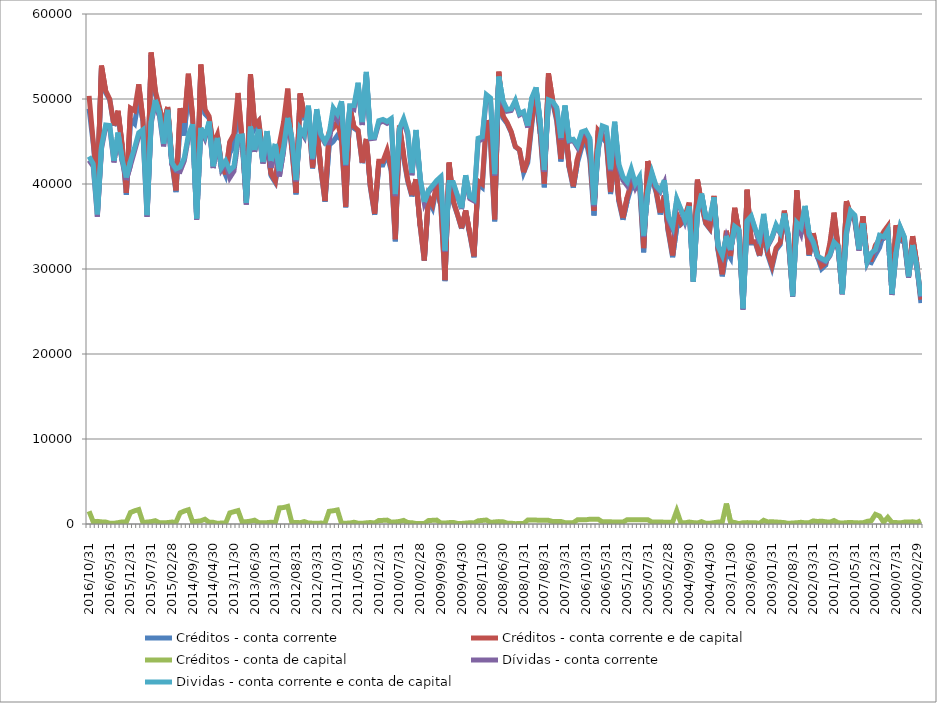
| Category | Créditos - conta corrente | Créditos - conta corrente e de capital | Créditos - conta de capital | Dívidas - conta corrente | Dividas - conta corrente e conta de capital |
|---|---|---|---|---|---|
| 2016/10/31 | 48865.324 | 50365.243 | 1499.919 | 42779.808 | 43222.333 |
| 2016/09/30 | 44779.5 | 45046.171 | 266.672 | 42072.833 | 42371.648 |
| 2016/08/31 | 39434.341 | 39742.585 | 308.244 | 36152.627 | 36422.026 |
| 2016/07/31 | 53685.147 | 53936.374 | 251.227 | 44141.913 | 44397.825 |
| 2016/06/30 | 50749.589 | 50980.381 | 230.791 | 46668.198 | 46935.631 |
| 2016/05/31 | 49876.997 | 49969.669 | 92.672 | 46650.019 | 46871.254 |
| 2016/04/30 | 46828.657 | 46913.542 | 84.885 | 42537.437 | 42752.591 |
| 2016/03/31 | 48455.402 | 48614.018 | 158.616 | 45665.224 | 46042.35 |
| 2016/02/29 | 44269.989 | 44514.844 | 244.855 | 42673.574 | 42911.811 |
| 2016/01/31 | 38735.212 | 38961.596 | 226.384 | 40464.613 | 40768.068 |
| 2015/12/31 | 47582.451 | 48935.823 | 1353.372 | 42168.585 | 42690.55 |
| 2015/11/30 | 47085.097 | 48635.657 | 1550.56 | 43868.27 | 44259.005 |
| 2015/10/31 | 50029.694 | 51730.105 | 1700.411 | 45622.916 | 46020.677 |
| 2015/09/30 | 47494.231 | 47688.633 | 194.401 | 46130.667 | 46377.412 |
| 2015/08/31 | 37550.584 | 37776.321 | 225.736 | 36134.857 | 36338.492 |
| 2015/07/31 | 55192.791 | 55473.969 | 281.178 | 47129.334 | 47392.89 |
| 2015/06/30 | 50593.165 | 50982.056 | 388.891 | 49495.722 | 49883.516 |
| 2015/05/31 | 48882.201 | 49027.224 | 145.023 | 48025.627 | 48344.621 |
| 2015/04/30 | 46868.05 | 47002.537 | 134.488 | 44432.512 | 44742.882 |
| 2015/03/31 | 48893.271 | 49061.355 | 168.085 | 48298.176 | 48720.742 |
| 2015/02/28 | 42580.079 | 42807.416 | 227.337 | 42283.067 | 42533.148 |
| 2015/01/31 | 39049.224 | 39250.112 | 200.888 | 41561.184 | 41779.132 |
| 2014/12/31 | 47598.408 | 48907.463 | 1309.056 | 41467.886 | 41992.816 |
| 2014/11/30 | 45698.678 | 47218.859 | 1520.181 | 42716.403 | 43068.904 |
| 2014/10/31 | 51289.788 | 52965.5 | 1675.712 | 45413.674 | 45772.513 |
| 2014/09/30 | 47801.002 | 48058.895 | 257.893 | 46848.709 | 47035.557 |
| 2014/08/31 | 37288.677 | 37598.434 | 309.757 | 35813.914 | 35966.246 |
| 2014/07/31 | 53677.774 | 54052.556 | 374.782 | 46410.29 | 46590.428 |
| 2014/06/30 | 48237.107 | 48796.333 | 559.226 | 45357.3 | 45618.903 |
| 2014/05/31 | 47750.104 | 47959.809 | 209.705 | 47130.866 | 47344.483 |
| 2014/04/30 | 44440.039 | 44634.246 | 194.207 | 41876.816 | 42083.543 |
| 2014/03/31 | 45718.631 | 45802.101 | 83.47 | 44998.532 | 45416.668 |
| 2014/02/28 | 42192.799 | 42305.034 | 112.234 | 41705.637 | 41951.932 |
| 2014/01/31 | 41041.676 | 41138.525 | 96.849 | 42498.017 | 42712.708 |
| 2013/12/31 | 43663.341 | 44967.303 | 1303.961 | 40742.037 | 41610.384 |
| 2013/11/30 | 44427.846 | 45873.119 | 1445.273 | 41506.413 | 42077.54 |
| 2013/10/31 | 49134.919 | 50712.839 | 1577.92 | 45003.42 | 45590.482 |
| 2013/09/30 | 44894.642 | 45125.674 | 231.032 | 45381.384 | 45656.483 |
| 2013/08/31 | 37713.968 | 37985.905 | 271.938 | 37562.827 | 37789.121 |
| 2013/07/31 | 52570.013 | 52903.759 | 333.746 | 46488.663 | 46750.494 |
| 2013/06/30 | 46489.944 | 46937.577 | 447.633 | 43788.922 | 44007.846 |
| 2013/05/31 | 47283.995 | 47441.362 | 157.368 | 46282.401 | 46459.027 |
| 2013/04/30 | 43411.575 | 43559.545 | 147.97 | 42415.729 | 42585.29 |
| 2013/03/31 | 44620.447 | 44781.299 | 160.852 | 44816.402 | 46216.97 |
| 2013/02/28 | 40966.018 | 41175.761 | 209.743 | 41916.541 | 42713.792 |
| 2013/01/31 | 40176.188 | 40334.085 | 157.897 | 43998.849 | 44710.725 |
| 2012/12/31 | 42817.345 | 44715.946 | 1898.601 | 40889.678 | 41533.029 |
| 2012/11/30 | 45333.276 | 47268.401 | 1935.124 | 43902.328 | 44335.808 |
| 2012/10/31 | 49149.909 | 51221.476 | 2071.566 | 47334.229 | 47773.125 |
| 2012/09/30 | 44021.937 | 44192.649 | 170.712 | 45202.851 | 45388.513 |
| 2012/08/31 | 38777.041 | 38964.997 | 187.956 | 40314.062 | 40461.688 |
| 2012/07/31 | 50503.224 | 50657.508 | 154.283 | 46342.998 | 46507.596 |
| 2012/06/30 | 47819.239 | 48104.133 | 284.894 | 45550.163 | 45776.288 |
| 2012/05/31 | 48032.994 | 48143.264 | 110.27 | 49039.161 | 49220.692 |
| 2012/04/30 | 41833.358 | 41934.742 | 101.384 | 42847.488 | 43020.197 |
| 2012/03/31 | 46686.481 | 46770.052 | 83.57 | 48506.022 | 48808 |
| 2012/02/29 | 41717.915 | 41826.51 | 108.595 | 45689.735 | 45867.625 |
| 2012/01/31 | 37913.349 | 37998.492 | 85.143 | 44809.387 | 44968.71 |
| 2011/12/31 | 44590.129 | 46083.83 | 1493.701 | 44852.337 | 45903.698 |
| 2011/11/30 | 45004.77 | 46561.74 | 1556.97 | 48259.005 | 48947.917 |
| 2011/10/31 | 45700.279 | 47354.417 | 1654.138 | 47527.197 | 48232.286 |
| 2011/09/30 | 45175.007 | 45252.777 | 77.77 | 49529.768 | 49748.628 |
| 2011/08/31 | 37250.593 | 37345.99 | 95.397 | 42125.47 | 42307.308 |
| 2011/07/31 | 48927.305 | 49039.976 | 112.672 | 49016.807 | 49220.827 |
| 2011/06/30 | 46558.073 | 46767.076 | 209.003 | 48789.673 | 49240.05 |
| 2011/05/31 | 46233.51 | 46324.369 | 90.859 | 51560.714 | 51915.641 |
| 2011/04/30 | 42452.263 | 42533.743 | 81.481 | 46950.063 | 47284.195 |
| 2011/03/31 | 45164.581 | 45304.417 | 139.836 | 52912.939 | 53184.11 |
| 2011/02/28 | 39480.706 | 39656.781 | 176.076 | 45319.193 | 45484.118 |
| 2011/01/31 | 36382.839 | 36495.232 | 112.393 | 45378.393 | 45521.048 |
| 2010/12/31 | 42268.005 | 42680.571 | 412.566 | 47151.289 | 47444.972 |
| 2010/11/30 | 42242.776 | 42669.084 | 426.308 | 47401.449 | 47602 |
| 2010/10/31 | 43518.307 | 43974.708 | 456.401 | 47141.62 | 47343.472 |
| 2010/09/30 | 41546.292 | 41757.545 | 211.253 | 47401.799 | 47680.958 |
| 2010/08/31 | 33259.686 | 33503.322 | 243.636 | 38582.987 | 38820.814 |
| 2010/07/31 | 46563.524 | 46859.982 | 296.457 | 46272.704 | 46554.239 |
| 2010/06/30 | 43044.955 | 43467.503 | 422.548 | 47332.352 | 47683.783 |
| 2010/05/31 | 40320.38 | 40487.827 | 167.447 | 45827.206 | 46109.295 |
| 2010/04/30 | 38540.234 | 38693.411 | 153.177 | 41019.852 | 41289.234 |
| 2010/03/31 | 40493.285 | 40545.539 | 52.254 | 46122.28 | 46363.125 |
| 2010/02/28 | 35025.989 | 35094.201 | 68.212 | 40592.449 | 40740.598 |
| 2010/01/31 | 30966.787 | 31015.871 | 49.084 | 37759.23 | 37886.515 |
| 2009/12/31 | 38157.869 | 38559.493 | 401.624 | 38983.311 | 39220.399 |
| 2009/11/30 | 37175.876 | 37607.532 | 431.655 | 39645.531 | 39804.06 |
| 2009/10/31 | 39609.192 | 40067.575 | 458.383 | 40243.771 | 40402.308 |
| 2009/09/30 | 37442.278 | 37552.341 | 110.062 | 40681.426 | 40852.609 |
| 2009/08/31 | 28572.592 | 28685.792 | 113.2 | 32033.87 | 32178.679 |
| 2009/07/31 | 42363.113 | 42525.939 | 162.826 | 39993.303 | 40169.506 |
| 2009/06/30 | 37838.124 | 38023.893 | 185.769 | 40026.803 | 40176.509 |
| 2009/05/31 | 36396.93 | 36466.817 | 69.886 | 38555.81 | 38675.565 |
| 2009/04/30 | 34748.541 | 34813.308 | 64.768 | 37049.639 | 37163.028 |
| 2009/03/31 | 36794.437 | 36899.79 | 105.353 | 40702.64 | 41027.714 |
| 2009/02/28 | 34022.706 | 34168.015 | 145.309 | 38281.039 | 38502.902 |
| 2009/01/31 | 31373.656 | 31499.555 | 125.899 | 38010.367 | 38191.748 |
| 2008/12/31 | 39991.148 | 40363.438 | 372.29 | 45012.269 | 45373.298 |
| 2008/11/30 | 39584.714 | 40004.344 | 419.63 | 45281.719 | 45556.954 |
| 2008/10/31 | 47028.76 | 47497.248 | 468.488 | 50253.952 | 50529.095 |
| 2008/09/30 | 44916.178 | 45099.587 | 183.409 | 49885.044 | 50133.298 |
| 2008/08/31 | 35595.77 | 35837.314 | 241.544 | 40952.559 | 41168.991 |
| 2008/07/31 | 52932.788 | 53213.696 | 280.908 | 52359.896 | 52636.34 |
| 2008/06/30 | 47768.571 | 48028.962 | 260.391 | 49572.859 | 49826.321 |
| 2008/05/31 | 47126.155 | 47230.337 | 104.181 | 48561.487 | 48766.157 |
| 2008/04/30 | 46064.185 | 46154.75 | 90.565 | 48647.566 | 48839.337 |
| 2008/03/31 | 44369.757 | 44408.953 | 39.196 | 49641.482 | 49838.463 |
| 2008/02/29 | 43993.223 | 44047.61 | 54.386 | 48128.79 | 48262.599 |
| 2008/01/31 | 41330.683 | 41383.726 | 53.043 | 48400.873 | 48513.981 |
| 2007/12/31 | 42510.026 | 42970.91 | 460.884 | 46641.702 | 46855.295 |
| 2007/11/30 | 47064.574 | 47525.459 | 460.884 | 49972.395 | 50185.988 |
| 2007/10/31 | 50595.727 | 51056.612 | 460.884 | 51156.973 | 51370.566 |
| 2007/09/30 | 45920.895 | 46350.661 | 429.766 | 47146.113 | 47353.434 |
| 2007/08/31 | 39604.837 | 40034.602 | 429.766 | 41439.096 | 41646.417 |
| 2007/07/31 | 52586.802 | 53016.568 | 429.766 | 49692.301 | 49899.622 |
| 2007/06/30 | 49604.397 | 49901.512 | 297.116 | 49531.163 | 49712.34 |
| 2007/05/31 | 47389.89 | 47687.005 | 297.116 | 48827.263 | 49008.44 |
| 2007/04/30 | 42645.238 | 42942.354 | 297.116 | 45253.339 | 45434.516 |
| 2007/03/31 | 47119.034 | 47276.427 | 157.393 | 49096.511 | 49232.241 |
| 2007/02/28 | 41909.062 | 42066.455 | 157.393 | 45005.449 | 45141.179 |
| 2007/01/31 | 39567.903 | 39725.296 | 157.393 | 45122.253 | 45257.983 |
| 2006/12/31 | 42493.102 | 42981.354 | 488.251 | 44310.571 | 44529.362 |
| 2006/11/30 | 44225.937 | 44714.188 | 488.251 | 45901.924 | 46120.715 |
| 2006/10/31 | 45279.5 | 45767.751 | 488.251 | 46071.176 | 46289.967 |
| 2006/09/30 | 42867.085 | 43433.291 | 566.206 | 45194.091 | 45376.761 |
| 2006/08/31 | 36293.87 | 36860.077 | 566.206 | 37385.712 | 37568.382 |
| 2006/07/31 | 45742.355 | 46308.561 | 566.206 | 43927.211 | 44109.881 |
| 2006/06/30 | 45496.876 | 45754.67 | 257.795 | 46621.235 | 46836.163 |
| 2006/05/31 | 44843.108 | 45100.903 | 257.795 | 46434.217 | 46649.145 |
| 2006/04/30 | 38809.566 | 39067.361 | 257.795 | 41515.806 | 41730.734 |
| 2006/03/31 | 43607.533 | 43832.983 | 225.45 | 46925.142 | 47331.075 |
| 2006/02/28 | 37959.459 | 38184.91 | 225.45 | 41942.151 | 42348.084 |
| 2006/01/31 | 35786.519 | 36011.969 | 225.45 | 40442.869 | 40848.802 |
| 2005/12/31 | 37929.768 | 38426.374 | 496.606 | 39805.798 | 40253.221 |
| 2005/11/30 | 39649.07 | 40145.676 | 496.606 | 41315.081 | 41762.504 |
| 2005/10/31 | 39463.619 | 39960.225 | 496.606 | 39614.164 | 40061.587 |
| 2005/09/30 | 39961.478 | 40465.081 | 503.603 | 40686.716 | 40863.348 |
| 2005/08/31 | 31960.543 | 32464.146 | 503.603 | 33762.505 | 33939.137 |
| 2005/07/31 | 42200.762 | 42704.365 | 503.603 | 39018.137 | 39194.768 |
| 2005/06/30 | 40661.699 | 40892.315 | 230.616 | 41173.491 | 41350.593 |
| 2005/05/31 | 39040.429 | 39271.045 | 230.616 | 39621.075 | 39798.177 |
| 2005/04/30 | 36420.107 | 36650.722 | 230.616 | 39078.367 | 39255.468 |
| 2005/03/31 | 38428.449 | 38645.191 | 216.741 | 40159.311 | 40445.44 |
| 2005/02/28 | 34243.246 | 34459.987 | 216.741 | 35815.337 | 36101.466 |
| 2005/01/31 | 31381.428 | 31598.169 | 216.741 | 34703.146 | 34989.275 |
| 2004/12/31 | 34921.161 | 36480.578 | 1559.416 | 38079.847 | 38264.98 |
| 2004/11/30 | 35258.483 | 35410.064 | 151.582 | 36941.07 | 37038.601 |
| 2004/10/31 | 36082.633 | 36222.787 | 140.155 | 35530.063 | 35763.822 |
| 2004/09/30 | 37587.151 | 37817.782 | 230.631 | 37142.314 | 37378.087 |
| 2004/08/31 | 29303.903 | 29466.226 | 162.323 | 28485.266 | 28532.655 |
| 2004/07/31 | 40391.217 | 40512.158 | 120.941 | 36611.975 | 36671.081 |
| 2004/06/30 | 37426.009 | 37699.581 | 273.571 | 38739.022 | 38877.359 |
| 2004/05/31 | 35345.853 | 35431.488 | 85.635 | 36069.552 | 36130.741 |
| 2004/04/30 | 34705.086 | 34791.392 | 86.306 | 35905.597 | 35995.834 |
| 2004/03/31 | 38445.459 | 38605.422 | 159.963 | 38076.175 | 38433.197 |
| 2004/02/29 | 32106.976 | 32332.754 | 225.777 | 32623.445 | 32698.931 |
| 2004/01/31 | 29142.08 | 29378.555 | 236.475 | 31534.566 | 31639.608 |
| 2003/12/31 | 32081.524 | 34487.539 | 2406.015 | 33694.456 | 33892.765 |
| 2003/11/30 | 31292.202 | 31533.892 | 241.69 | 32168.89 | 32264.418 |
| 2003/10/31 | 37016.368 | 37196.539 | 180.171 | 34888.535 | 35007.007 |
| 2003/09/30 | 34399.433 | 34442.21 | 42.777 | 34537.46 | 34649.778 |
| 2003/08/31 | 25770.064 | 25911.534 | 141.47 | 25233.76 | 25356.541 |
| 2003/07/31 | 39167.48 | 39330.198 | 162.719 | 35571.599 | 35675.047 |
| 2003/06/30 | 33052.052 | 33209.165 | 157.113 | 36067.111 | 36219.054 |
| 2003/05/31 | 33062.175 | 33208.311 | 146.136 | 34586.899 | 34667.578 |
| 2003/04/30 | 31534.199 | 31610.706 | 76.507 | 33002.871 | 33477.174 |
| 2003/03/31 | 34500.935 | 34936.355 | 435.42 | 36055.956 | 36493.825 |
| 2003/02/28 | 31639.31 | 31881.184 | 241.874 | 32705.446 | 32843.471 |
| 2003/01/31 | 30153.964 | 30419.82 | 265.855 | 33625.698 | 33757.555 |
| 2002/12/31 | 32237.472 | 32469.062 | 231.59 | 35024.326 | 35196.09 |
| 2002/11/30 | 32886.534 | 33089.892 | 203.358 | 34223.345 | 34316.966 |
| 2002/10/31 | 36714.252 | 36875.148 | 160.895 | 36242.348 | 36530.86 |
| 2002/09/30 | 33068.074 | 33142.518 | 74.444 | 33675.395 | 33831.841 |
| 2002/08/31 | 27101.243 | 27222.394 | 121.151 | 26714.697 | 26796.4 |
| 2002/07/31 | 39112.451 | 39256.693 | 144.242 | 35309.52 | 35449.79 |
| 2002/06/30 | 34122.269 | 34324.451 | 202.183 | 34174.707 | 34891.635 |
| 2002/05/31 | 36273.714 | 36411.908 | 138.193 | 37325.265 | 37428.983 |
| 2002/04/30 | 31561.485 | 31720.626 | 159.14 | 33856.691 | 34078.083 |
| 2002/03/31 | 33852.368 | 34217.146 | 364.778 | 32988.357 | 33183.998 |
| 2002/02/28 | 31427.583 | 31723.143 | 295.56 | 31392.254 | 31535.27 |
| 2002/01/31 | 30015.863 | 30349.102 | 333.239 | 31077.605 | 31237.654 |
| 2001/12/31 | 30471.142 | 30729.514 | 258.373 | 30848.082 | 30975.974 |
| 2001/11/30 | 32813.736 | 33028.679 | 214.943 | 31547.313 | 31665.884 |
| 2001/10/31 | 36226.249 | 36633.086 | 406.837 | 33036.746 | 33148.161 |
| 2001/09/30 | 32309.08 | 32460.336 | 151.256 | 32507.351 | 32661.468 |
| 2001/08/31 | 27099.222 | 27211.512 | 112.29 | 27022.929 | 27059.13 |
| 2001/07/31 | 37834.406 | 37990.18 | 155.775 | 34058.265 | 34346.79 |
| 2001/06/30 | 36225.254 | 36413.975 | 188.721 | 36712.203 | 36831.973 |
| 2001/05/31 | 35684.363 | 35828.343 | 143.98 | 36268.087 | 36347.883 |
| 2001/04/30 | 32301.453 | 32431.574 | 130.121 | 32162.47 | 32311.079 |
| 2001/03/31 | 36058.673 | 36205.524 | 146.852 | 35236.002 | 35388.675 |
| 2001/02/28 | 30915.979 | 31227.575 | 311.596 | 30714.949 | 30826.905 |
| 2001/01/31 | 30750.041 | 31133.39 | 383.349 | 31759.285 | 31881.371 |
| 2000/12/31 | 31660.153 | 32793.98 | 1133.827 | 32105.941 | 32245.66 |
| 2000/11/30 | 32520.121 | 33451.694 | 931.573 | 33845.882 | 33960.107 |
| 2000/10/31 | 34184.449 | 34396.37 | 211.92 | 33655.963 | 33778.561 |
| 2000/09/30 | 34282.965 | 35058.959 | 775.994 | 34382.481 | 34575.184 |
| 2000/08/31 | 27175.482 | 27356.593 | 181.111 | 26952.319 | 27058.643 |
| 2000/07/31 | 34976.388 | 35149.94 | 173.552 | 31843.051 | 31966.308 |
| 2000/06/30 | 33412.095 | 33542.612 | 130.517 | 34833.159 | 34923.773 |
| 2000/05/31 | 33091.811 | 33313.239 | 221.428 | 33663.078 | 33778.008 |
| 2000/04/30 | 29039.206 | 29268.886 | 229.681 | 28992.954 | 29129.607 |
| 2000/03/31 | 33604.908 | 33862.596 | 257.687 | 32643.932 | 32817.117 |
| 2000/02/29 | 30510.549 | 30683.664 | 173.114 | 30165.011 | 30320.983 |
| 2000/01/31 | 26000.538 | 26389.196 | 388.657 | 26676.313 | 26804.97 |